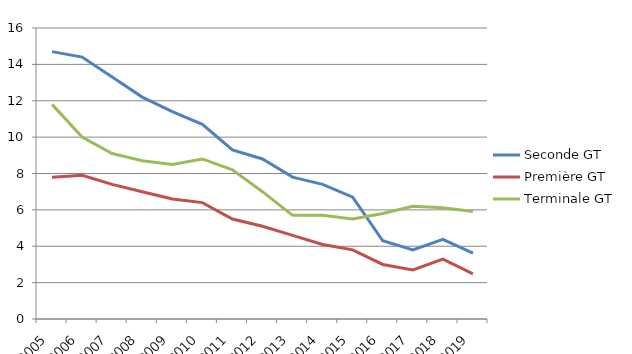
| Category | Seconde GT | Première GT | Terminale GT |
|---|---|---|---|
| 2005.0 | 14.7 | 7.8 | 11.8 |
| 2006.0 | 14.4 | 7.9 | 10 |
| 2007.0 | 13.3 | 7.4 | 9.1 |
| 2008.0 | 12.2 | 7 | 8.7 |
| 2009.0 | 11.4 | 6.6 | 8.5 |
| 2010.0 | 10.7 | 6.4 | 8.8 |
| 2011.0 | 9.3 | 5.5 | 8.2 |
| 2012.0 | 8.8 | 5.1 | 7 |
| 2013.0 | 7.8 | 4.6 | 5.7 |
| 2014.0 | 7.4 | 4.1 | 5.7 |
| 2015.0 | 6.7 | 3.8 | 5.5 |
| 2016.0 | 4.3 | 3 | 5.8 |
| 2017.0 | 3.8 | 2.7 | 6.2 |
| 2018.0 | 4.38 | 3.29 | 6.12 |
| 2019.0 | 3.62 | 2.48 | 5.91 |